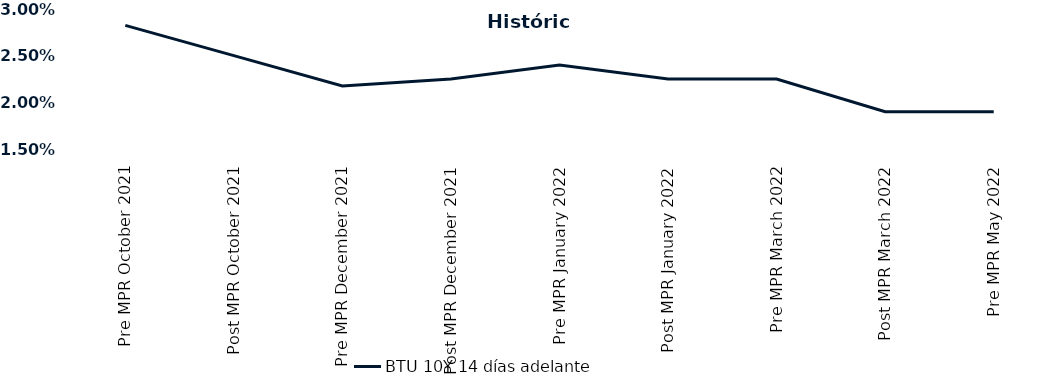
| Category | BTU 10Y 14 días adelante |
|---|---|
| Pre MPR October 2021 | 0.028 |
| Post MPR October 2021 | 0.025 |
| Pre MPR December 2021 | 0.022 |
| Post MPR December 2021 | 0.022 |
| Pre MPR January 2022 | 0.024 |
| Post MPR January 2022 | 0.022 |
| Pre MPR March 2022 | 0.022 |
| Post MPR March 2022 | 0.019 |
| Pre MPR May 2022 | 0.019 |